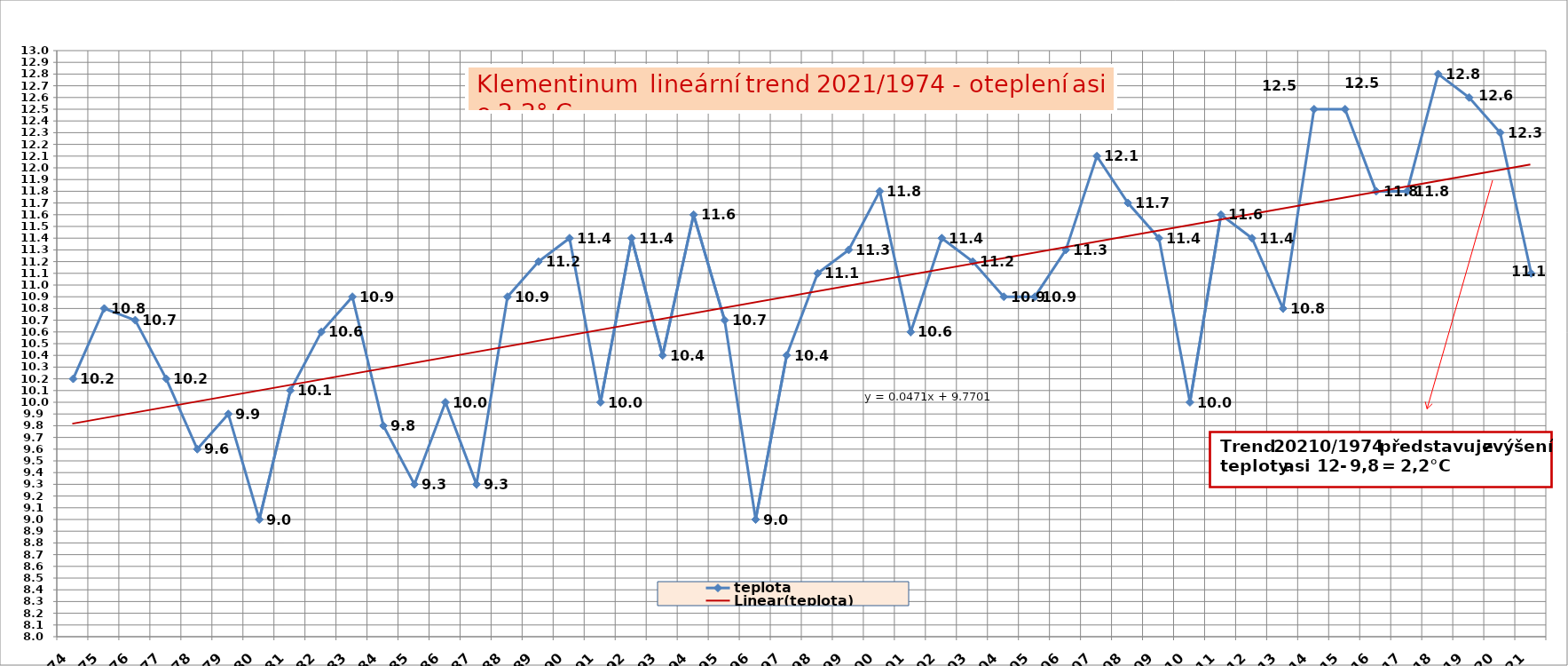
| Category | teplota |
|---|---|
| 1974 | 10.2 |
| 1975 | 10.8 |
| 1976 | 10.7 |
| 1977 | 10.2 |
| 1978 | 9.6 |
| 1979 | 9.9 |
| 1980 | 9 |
| 1981 | 10.1 |
| 1982 | 10.6 |
| 1983 | 10.9 |
| 1984 | 9.8 |
| 1985 | 9.3 |
| 1986 | 10 |
| 1987 | 9.3 |
| 1988 | 10.9 |
| 1989 | 11.2 |
| 1990 | 11.4 |
| 1991 | 10 |
| 1992 | 11.4 |
| 1993 | 10.4 |
| 1994 | 11.6 |
| 1995 | 10.7 |
| 1996 | 9 |
| 1997 | 10.4 |
| 1998 | 11.1 |
| 1999 | 11.3 |
| 2000 | 11.8 |
| 2001 | 10.6 |
| 2002 | 11.4 |
| 2003 | 11.2 |
| 2004 | 10.9 |
| 2005 | 10.9 |
| 2006 | 11.3 |
| 2007 | 12.1 |
| 2008 | 11.7 |
| 2009 | 11.4 |
| 2010 | 10 |
| 2011 | 11.6 |
| 2012 | 11.4 |
| 2013 | 10.8 |
| 2014 | 12.5 |
| 2015 | 12.5 |
| 2016 | 11.8 |
| 2017 | 11.8 |
| 2018 | 12.8 |
| 2019 | 12.6 |
| 2020 | 12.3 |
| 2021 | 11.1 |